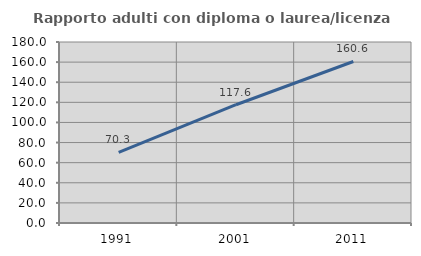
| Category | Rapporto adulti con diploma o laurea/licenza media  |
|---|---|
| 1991.0 | 70.314 |
| 2001.0 | 117.624 |
| 2011.0 | 160.622 |